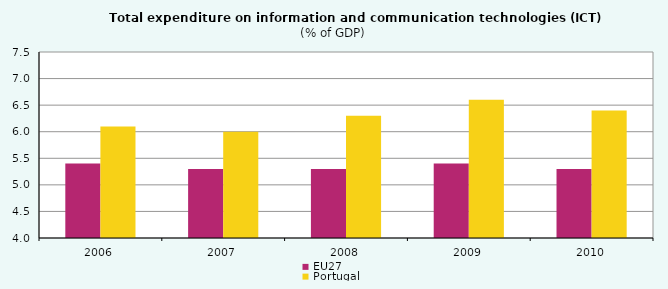
| Category | EU27 | Portugal |
|---|---|---|
| 2006.0 | 5.4 | 6.1 |
| 2007.0 | 5.3 | 6 |
| 2008.0 | 5.3 | 6.3 |
| 2009.0 | 5.4 | 6.6 |
| 2010.0 | 5.3 | 6.4 |